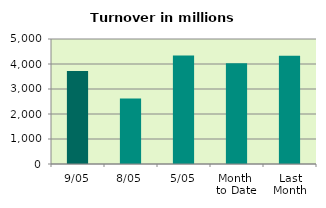
| Category | Series 0 |
|---|---|
| 9/05 | 3715.148 |
| 8/05 | 2619.775 |
| 5/05 | 4344.781 |
| Month 
to Date | 4029.429 |
| Last
Month | 4332.281 |